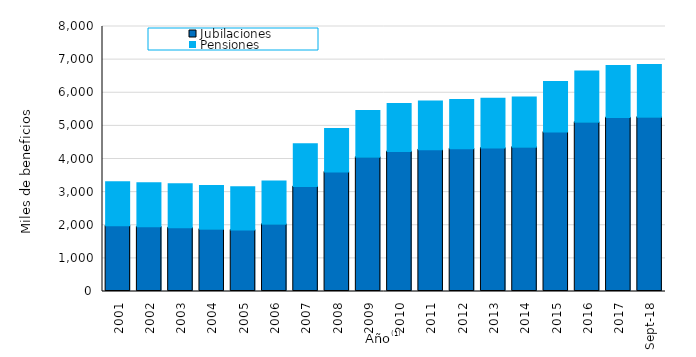
| Category | Jubilaciones | Pensiones |
|---|---|---|
| 2001.0 | 1984588 | 1327098 |
| 2002.0 | 1953410 | 1327077 |
| 2003.0 | 1925531 | 1327478 |
| 2004.0 | 1881671 | 1319835 |
| 2005.0 | 1856967 | 1308369 |
| 2006.0 | 2031435 | 1302512 |
| 2007.0 | 3167799 | 1292554 |
| 2008.0 | 3611162 | 1308234 |
| 2009.0 | 4053666 | 1407797 |
| 2010.0 | 4224398 | 1447749 |
| 2011.0 | 4281335 | 1467523 |
| 2012.0 | 4309368 | 1483444 |
| 2013.0 | 4332216 | 1501790 |
| 2014.0 | 4357746 | 1514932 |
| 2015.0 | 4815402 | 1526785 |
| 2016.0 | 5111178 | 1546728 |
| 2017.0 | 5249686 | 1574265 |
| 43344.0 | 5263441 | 1590894 |